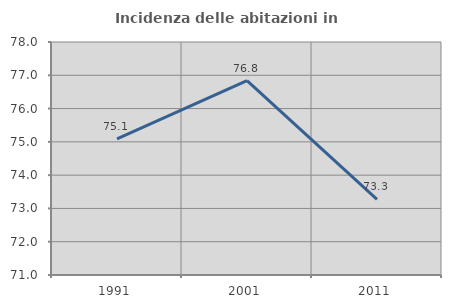
| Category | Incidenza delle abitazioni in proprietà  |
|---|---|
| 1991.0 | 75.087 |
| 2001.0 | 76.84 |
| 2011.0 | 73.271 |